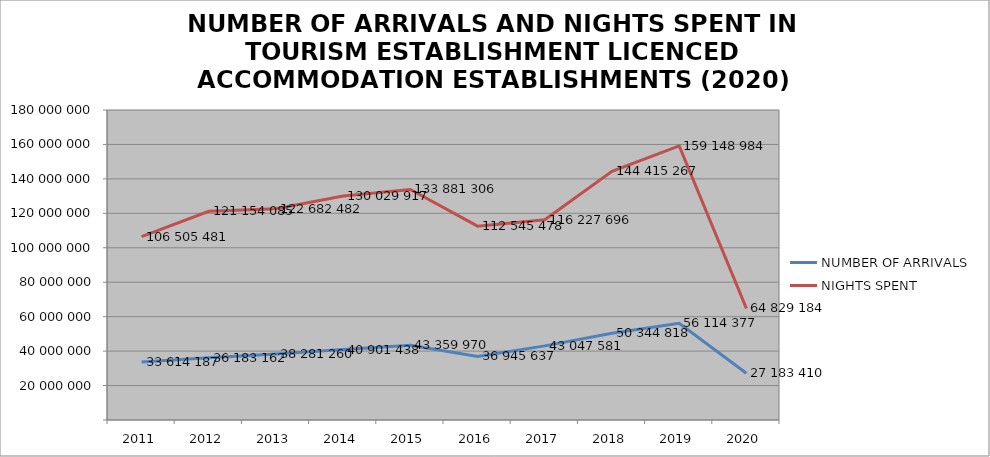
| Category | NUMBER OF ARRIVALS | NIGHTS SPENT |
|---|---|---|
| 2011 | 33614187 | 106505481 |
| 2012 | 36183162 | 121154085 |
| 2013 | 38281260 | 122682482 |
| 2014 | 40901438 | 130029917 |
| 2015 | 43359970 | 133881306 |
| 2016 | 36945637 | 112545478 |
| 2017 | 43047581 | 116227696 |
| 2018 | 50344818 | 144415267 |
| 2019 | 56114377 | 159148984 |
| 2020 | 27183410 | 64829184 |